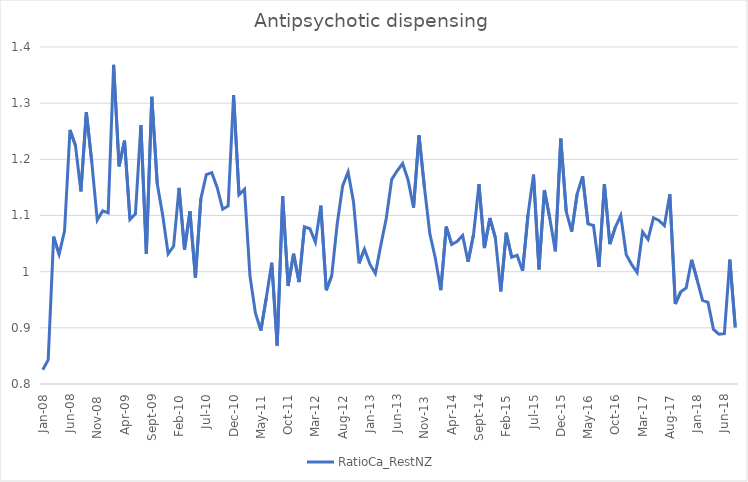
| Category | RatioCa_RestNZ |
|---|---|
| 2008-01-01 | 0.825 |
| 2008-02-01 | 0.843 |
| 2008-03-01 | 1.062 |
| 2008-04-01 | 1.031 |
| 2008-05-01 | 1.072 |
| 2008-06-01 | 1.252 |
| 2008-07-01 | 1.225 |
| 2008-08-01 | 1.143 |
| 2008-09-01 | 1.284 |
| 2008-10-01 | 1.194 |
| 2008-11-01 | 1.092 |
| 2008-12-01 | 1.108 |
| 2009-01-01 | 1.105 |
| 2009-02-01 | 1.368 |
| 2009-03-01 | 1.187 |
| 2009-04-01 | 1.233 |
| 2009-05-01 | 1.093 |
| 2009-06-01 | 1.103 |
| 2009-07-01 | 1.261 |
| 2009-08-01 | 1.032 |
| 2009-09-01 | 1.311 |
| 2009-10-01 | 1.156 |
| 2009-11-01 | 1.1 |
| 2009-12-01 | 1.032 |
| 2010-01-01 | 1.045 |
| 2010-02-01 | 1.149 |
| 2010-03-01 | 1.039 |
| 2010-04-01 | 1.108 |
| 2010-05-01 | 0.989 |
| 2010-06-01 | 1.13 |
| 2010-07-01 | 1.173 |
| 2010-08-01 | 1.176 |
| 2010-09-01 | 1.149 |
| 2010-10-01 | 1.111 |
| 2010-11-01 | 1.117 |
| 2010-12-01 | 1.314 |
| 2011-01-01 | 1.137 |
| 2011-02-01 | 1.147 |
| 2011-03-01 | 0.993 |
| 2011-04-01 | 0.927 |
| 2011-05-01 | 0.895 |
| 2011-06-01 | 0.954 |
| 2011-07-01 | 1.016 |
| 2011-08-01 | 0.868 |
| 2011-09-01 | 1.134 |
| 2011-10-01 | 0.975 |
| 2011-11-01 | 1.032 |
| 2011-12-01 | 0.982 |
| 2012-01-01 | 1.08 |
| 2012-02-01 | 1.076 |
| 2012-03-01 | 1.053 |
| 2012-04-01 | 1.118 |
| 2012-05-01 | 0.967 |
| 2012-06-01 | 0.993 |
| 2012-07-01 | 1.085 |
| 2012-08-01 | 1.153 |
| 2012-09-01 | 1.178 |
| 2012-10-01 | 1.124 |
| 2012-11-01 | 1.015 |
| 2012-12-01 | 1.04 |
| 2013-01-01 | 1.013 |
| 2013-02-01 | 0.997 |
| 2013-03-01 | 1.047 |
| 2013-04-01 | 1.095 |
| 2013-05-01 | 1.164 |
| 2013-06-01 | 1.18 |
| 2013-07-01 | 1.193 |
| 2013-08-01 | 1.163 |
| 2013-09-01 | 1.114 |
| 2013-10-01 | 1.243 |
| 2013-11-01 | 1.15 |
| 2013-12-01 | 1.067 |
| 2014-01-01 | 1.024 |
| 2014-02-01 | 0.967 |
| 2014-03-01 | 1.08 |
| 2014-04-01 | 1.048 |
| 2014-05-01 | 1.054 |
| 2014-06-01 | 1.065 |
| 2014-07-01 | 1.017 |
| 2014-08-01 | 1.066 |
| 2014-09-01 | 1.156 |
| 2014-10-01 | 1.042 |
| 2014-11-01 | 1.096 |
| 2014-12-01 | 1.061 |
| 2015-01-01 | 0.965 |
| 2015-02-01 | 1.069 |
| 2015-03-01 | 1.026 |
| 2015-04-01 | 1.029 |
| 2015-05-01 | 1.001 |
| 2015-06-01 | 1.102 |
| 2015-07-01 | 1.173 |
| 2015-08-01 | 1.004 |
| 2015-09-01 | 1.145 |
| 2015-10-01 | 1.094 |
| 2015-11-01 | 1.036 |
| 2015-12-01 | 1.237 |
| 2016-01-01 | 1.107 |
| 2016-02-01 | 1.071 |
| 2016-03-01 | 1.138 |
| 2016-04-01 | 1.17 |
| 2016-05-01 | 1.085 |
| 2016-06-01 | 1.082 |
| 2016-07-01 | 1.008 |
| 2016-08-01 | 1.156 |
| 2016-09-01 | 1.049 |
| 2016-10-01 | 1.079 |
| 2016-11-01 | 1.1 |
| 2016-12-01 | 1.03 |
| 2017-01-01 | 1.013 |
| 2017-02-01 | 0.999 |
| 2017-03-01 | 1.071 |
| 2017-04-01 | 1.057 |
| 2017-05-01 | 1.096 |
| 2017-06-01 | 1.091 |
| 2017-07-01 | 1.082 |
| 2017-08-01 | 1.138 |
| 2017-09-01 | 0.942 |
| 2017-10-01 | 0.964 |
| 2017-11-01 | 0.971 |
| 2017-12-01 | 1.021 |
| 2018-01-01 | 0.986 |
| 2018-02-01 | 0.949 |
| 2018-03-01 | 0.945 |
| 2018-04-01 | 0.897 |
| 2018-05-01 | 0.889 |
| 2018-06-01 | 0.89 |
| 2018-07-01 | 1.022 |
| 2018-08-01 | 0.901 |